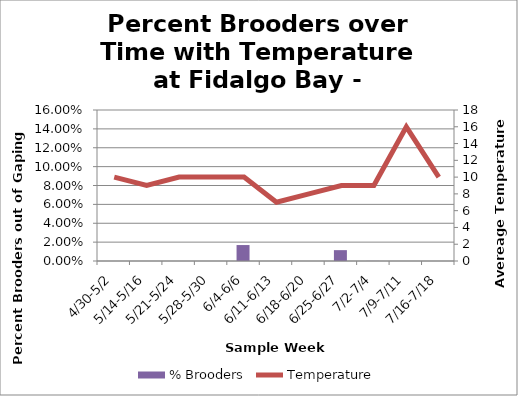
| Category | % Brooders |
|---|---|
| 4/30-5/2 | 0 |
| 5/14-5/16 | 0 |
| 5/21-5/24 | 0 |
| 5/28-5/30 | 0 |
| 6/4-6/6 | 0.017 |
| 6/11-6/13 | 0 |
| 6/18-6/20 | 0 |
| 6/25-6/27 | 0.012 |
| 7/2-7/4 | 0 |
| 7/9-7/11 | 0 |
| 7/16-7/18 | 0 |